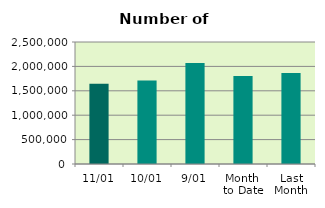
| Category | Series 0 |
|---|---|
| 11/01 | 1642662 |
| 10/01 | 1712088 |
| 9/01 | 2068936 |
| Month 
to Date | 1804222.75 |
| Last
Month | 1866821.895 |